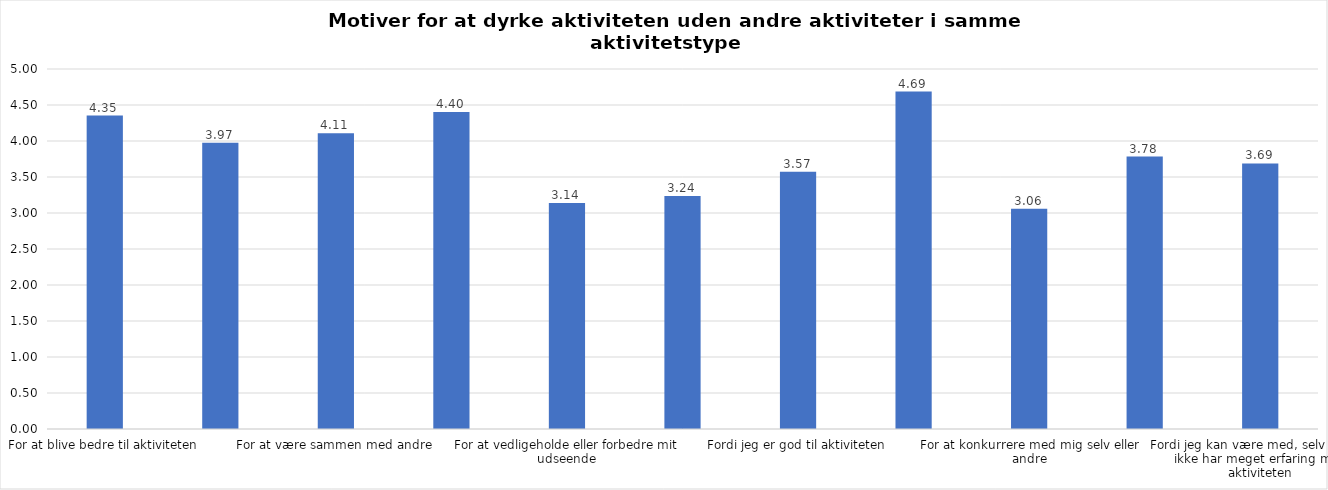
| Category | Gennemsnit |
|---|---|
| For at blive bedre til aktiviteten | 4.353 |
| For at vedligeholde eller forbedre min sundhed (fx helbred, fysisk form) | 3.975 |
| For at være sammen med andre | 4.106 |
| For at gøre noget godt for mig selv | 4.403 |
| For at vedligeholde eller forbedre mit udseende | 3.138 |
| Fordi andre i min omgangskreds opmuntrer mig til det | 3.237 |
| Fordi jeg er god til aktiviteten | 3.571 |
| Fordi jeg godt kan lide aktiviteten | 4.687 |
| For at konkurrere med mig selv eller andre | 3.058 |
| Fordi aktiviteten passer godt ind i min hverdag | 3.783 |
| Fordi jeg kan være med, selv om jeg ikke har meget erfaring med aktiviteten | 3.689 |